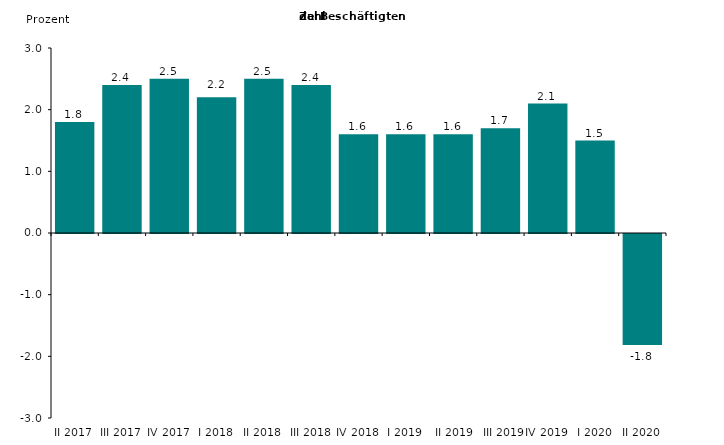
| Category | Series 0 |
|---|---|
| II 2017 | 1.8 |
| III 2017 | 2.4 |
| IV 2017 | 2.5 |
| I 2018 | 2.2 |
| II 2018 | 2.5 |
| III 2018 | 2.4 |
| IV 2018 | 1.6 |
| I 2019 | 1.6 |
|  II 2019 | 1.6 |
|  III 2019 | 1.7 |
| IV 2019 | 2.1 |
| I 2020 | 1.5 |
| II 2020 | -1.8 |